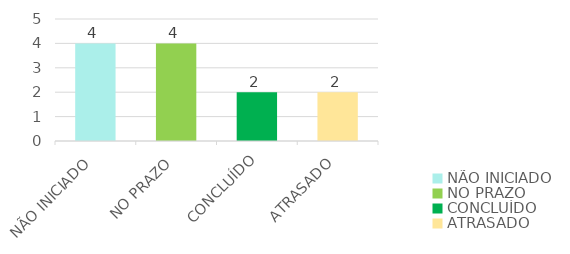
| Category | Series 0 |
|---|---|
| NÃO INICIADO | 4 |
| NO PRAZO | 4 |
| CONCLUÍDO | 2 |
| ATRASADO | 2 |